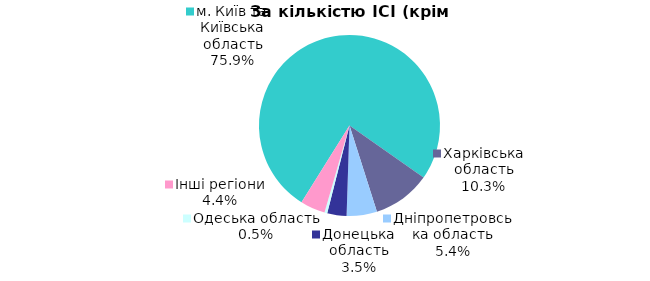
| Category | Series 0 |
|---|---|
| м. Київ та Київська область | 0.759 |
| Харківська область | 0.103 |
| Дніпропетровська область | 0.054 |
| Донецька область | 0.034 |
| Одеська область | 0.005 |
| Інші регіони | 0.044 |